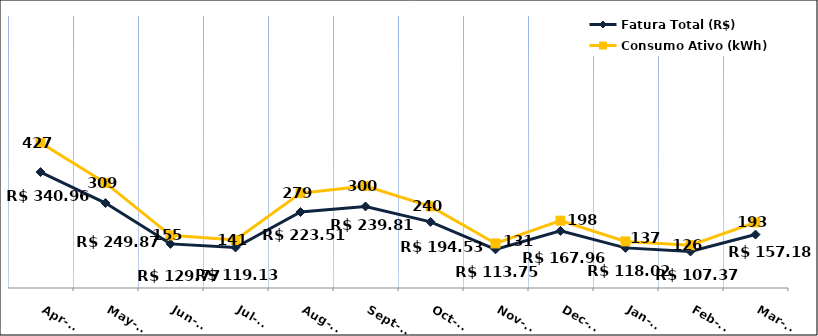
| Category | Fatura Total (R$) |
|---|---|
| 2023-04-01 | 340.96 |
| 2023-05-01 | 249.87 |
| 2023-06-01 | 129.77 |
| 2023-07-01 | 119.13 |
| 2023-08-01 | 223.51 |
| 2023-09-01 | 239.81 |
| 2023-10-01 | 194.53 |
| 2023-11-01 | 113.75 |
| 2023-12-01 | 167.96 |
| 2024-01-01 | 118.02 |
| 2024-02-01 | 107.37 |
| 2024-03-01 | 157.18 |